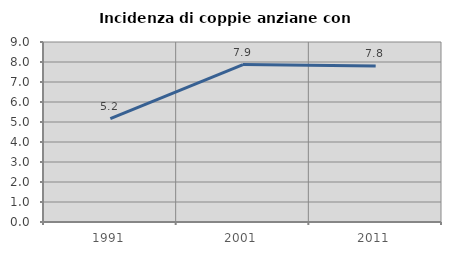
| Category | Incidenza di coppie anziane con figli |
|---|---|
| 1991.0 | 5.169 |
| 2001.0 | 7.87 |
| 2011.0 | 7.799 |